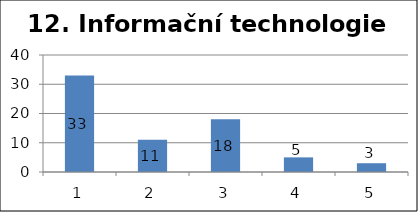
| Category | Series 1 |
|---|---|
| 0 | 33 |
| 1 | 11 |
| 2 | 18 |
| 3 | 5 |
| 4 | 3 |